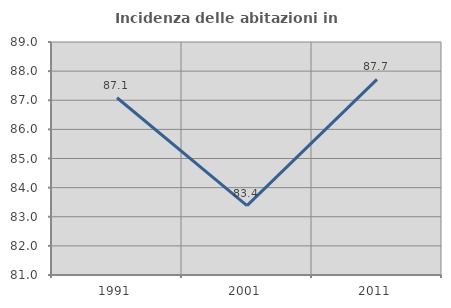
| Category | Incidenza delle abitazioni in proprietà  |
|---|---|
| 1991.0 | 87.085 |
| 2001.0 | 83.382 |
| 2011.0 | 87.715 |